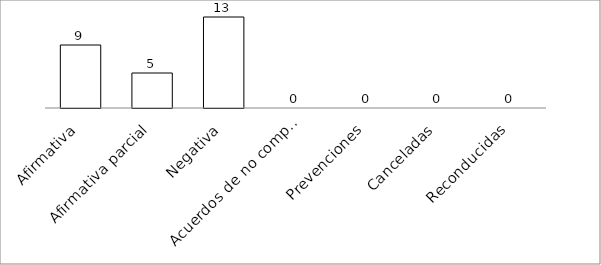
| Category | Series 0 |
|---|---|
| Afirmativa | 9 |
| Afirmativa parcial | 5 |
| Negativa | 13 |
| Acuerdos de no competencia | 0 |
| Prevenciones | 0 |
| Canceladas | 0 |
| Reconducidas | 0 |